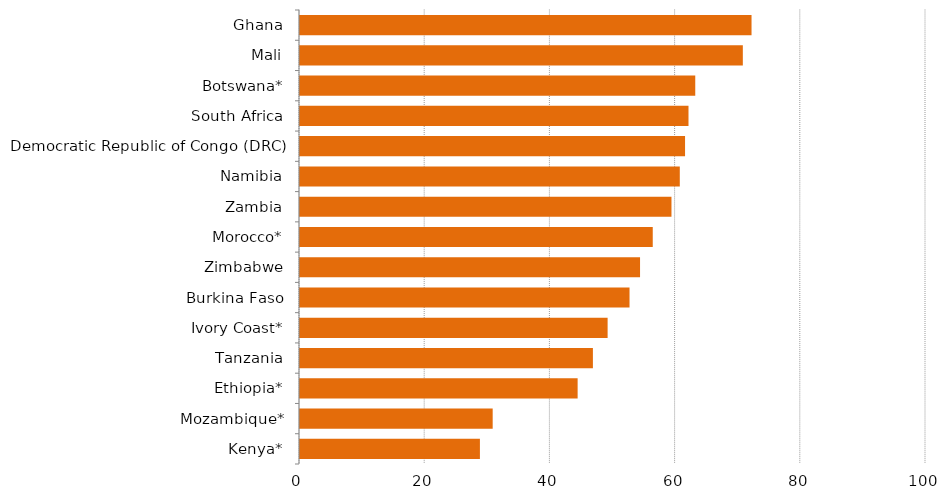
| Category | Series 0 |
|---|---|
| Kenya* | 28.74 |
| Mozambique* | 30.78 |
| Ethiopia* | 44.35 |
| Tanzania | 46.79 |
| Ivory Coast* | 49.14 |
| Burkina Faso | 52.64 |
| Zimbabwe | 54.32 |
| Morocco* | 56.35 |
| Zambia | 59.34 |
| Namibia | 60.67 |
| Democratic Republic of Congo (DRC) | 61.51 |
| South Africa | 62.06 |
| Botswana* | 63.14 |
| Mali | 70.74 |
| Ghana | 72.13 |